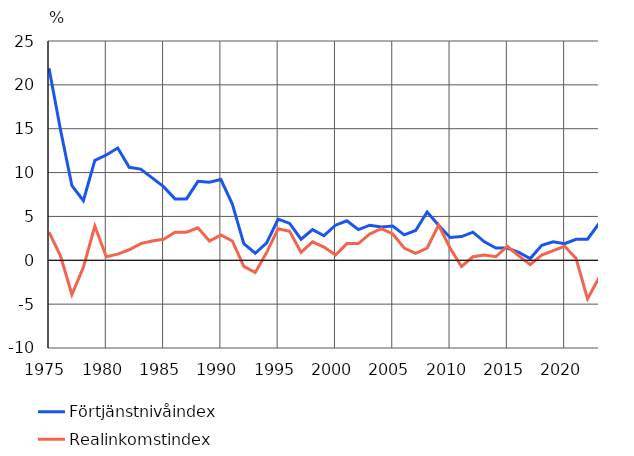
| Category | Förtjänstnivåindex | Realinkomstindex |
|---|---|---|
| 1975 | 21.9 | 3.2 |
| 1976 | 14.9 | 0.5 |
| 1977 | 8.5 | -3.9 |
| 1978 | 6.8 | -0.8 |
| 1979 | 11.4 | 3.9 |
| 1980 | 12 | 0.4 |
| 1981 | 12.8 | 0.7 |
| 1982 | 10.6 | 1.2 |
| 1983 | 10.4 | 1.9 |
| 1984 | 9.4 | 2.2 |
| 1985 | 8.4 | 2.4 |
| 1986 | 7 | 3.2 |
| 1987 | 7 | 3.2 |
| 1988 | 9 | 3.7 |
| 1989 | 8.9 | 2.2 |
| 1990 | 9.2 | 2.9 |
| 1991 | 6.4 | 2.2 |
| 1992 | 1.9 | -0.7 |
| 1993 | 0.8 | -1.4 |
| 1994 | 2 | 0.9 |
| 1995 | 4.7 | 3.6 |
| 1996 | 4.2 | 3.3 |
| 1997 | 2.4 | 0.9 |
| 1998 | 3.5 | 2.1 |
| 1999 | 2.8 | 1.5 |
| 2000 | 4 | 0.6 |
| 2001 | 4.5 | 1.9 |
| 2002 | 3.5 | 1.9 |
| 2003 | 4 | 3 |
| 2004 | 3.8 | 3.6 |
| 2005 | 3.9 | 3 |
| 2006 | 2.9 | 1.4 |
| 2007 | 3.4 | 0.8 |
| 2008 | 5.5 | 1.4 |
| 2009 | 4 | 4 |
| 2010 | 2.6 | 1.4 |
| 2011 | 2.7 | -0.7 |
| 2012 | 3.2 | 0.4 |
| 2013 | 2.1 | 0.6 |
| 2014 | 1.4 | 0.4 |
| 2015 | 1.4 | 1.6 |
| 2016 | 0.9 | 0.5 |
| 2017 | 0.2 | -0.5 |
| 2018 | 1.7 | 0.6 |
| 2019 | 2.1 | 1.1 |
| 2020 | 1.9 | 1.6 |
| 2021 | 2.4 | 0.2 |
| 2022 | 2.4 | -4.4 |
| 2023* | 4.2 | -2 |